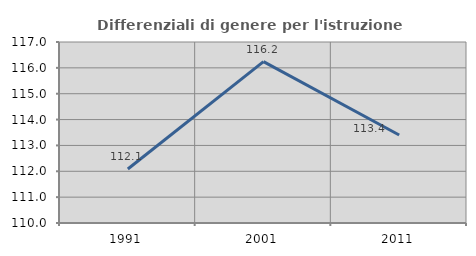
| Category | Differenziali di genere per l'istruzione superiore |
|---|---|
| 1991.0 | 112.09 |
| 2001.0 | 116.24 |
| 2011.0 | 113.401 |